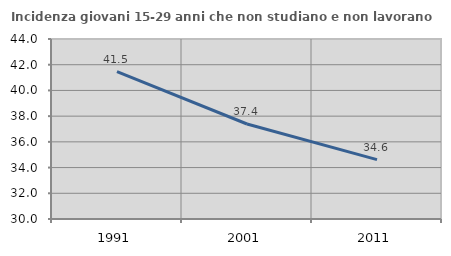
| Category | Incidenza giovani 15-29 anni che non studiano e non lavorano  |
|---|---|
| 1991.0 | 41.455 |
| 2001.0 | 37.388 |
| 2011.0 | 34.615 |